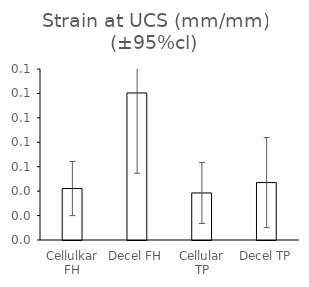
| Category | Series 0 |
|---|---|
| Cellulkar FH | 0.042 |
| Decel FH | 0.12 |
| Cellular TP | 0.039 |
| Decel TP | 0.047 |